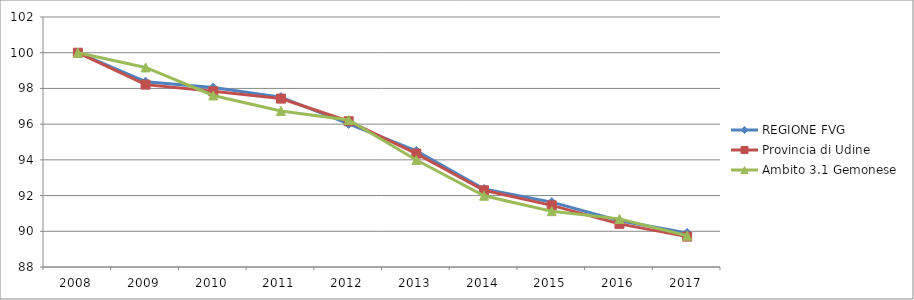
| Category | REGIONE FVG | Provincia di Udine | Ambito 3.1 Gemonese |
|---|---|---|---|
| 2008.0 | 100 | 100 | 100 |
| 2009.0 | 98.378 | 98.213 | 99.176 |
| 2010.0 | 98.049 | 97.839 | 97.605 |
| 2011.0 | 97.515 | 97.431 | 96.741 |
| 2012.0 | 96.012 | 96.162 | 96.231 |
| 2013.0 | 94.5 | 94.348 | 93.993 |
| 2014.0 | 92.37 | 92.296 | 91.991 |
| 2015.0 | 91.632 | 91.451 | 91.127 |
| 2016.0 | 90.595 | 90.414 | 90.695 |
| 2017.0 | 89.908 | 89.702 | 89.753 |